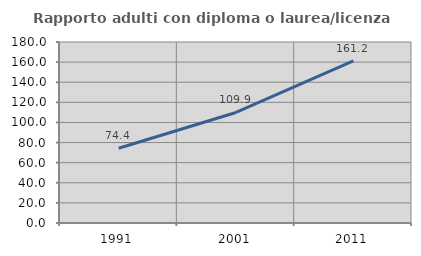
| Category | Rapporto adulti con diploma o laurea/licenza media  |
|---|---|
| 1991.0 | 74.393 |
| 2001.0 | 109.918 |
| 2011.0 | 161.246 |